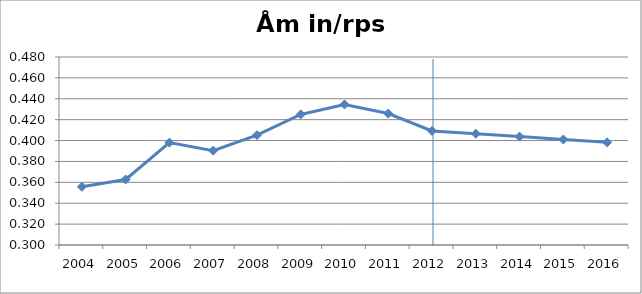
| Category | Åm in/rps in |
|---|---|
| 2004.0 | 0.356 |
| 2005.0 | 0.363 |
| 2006.0 | 0.398 |
| 2007.0 | 0.39 |
| 2008.0 | 0.405 |
| 2009.0 | 0.425 |
| 2010.0 | 0.435 |
| 2011.0 | 0.426 |
| 2012.0 | 0.409 |
| 2013.0 | 0.407 |
| 2014.0 | 0.404 |
| 2015.0 | 0.401 |
| 2016.0 | 0.398 |